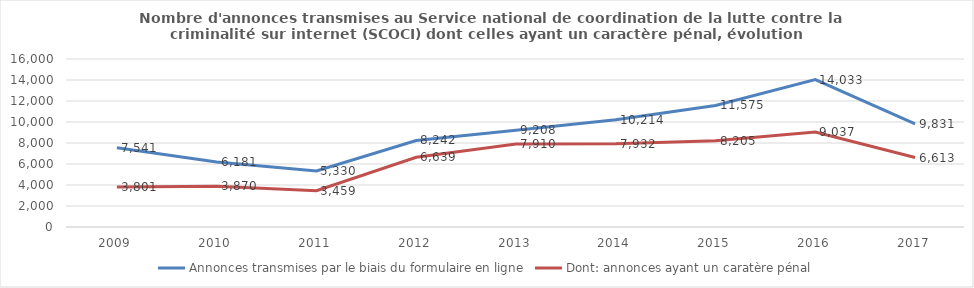
| Category | Annonces transmises par le biais du formulaire en ligne | Dont: annonces ayant un caratère pénal |
|---|---|---|
| 2009.0 | 7541 | 3801 |
| 2010.0 | 6181 | 3870 |
| 2011.0 | 5330 | 3459 |
| 2012.0 | 8242 | 6639 |
| 2013.0 | 9208 | 7910 |
| 2014.0 | 10214 | 7932 |
| 2015.0 | 11575 | 8205 |
| 2016.0 | 14033 | 9037 |
| 2017.0 | 9831 | 6613 |